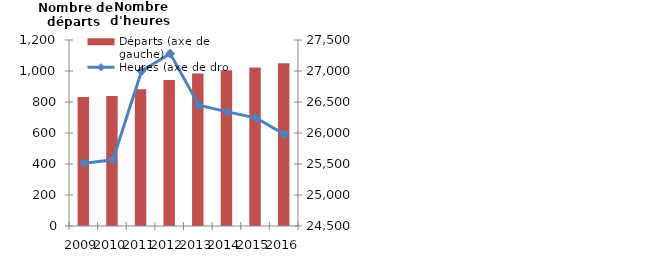
| Category | Départs (axe de gauche) |
|---|---|
| 2009.0 | 832.799 |
| 2010.0 | 838.642 |
| 2011.0 | 882.318 |
| 2012.0 | 941.368 |
| 2013.0 | 983.932 |
| 2014.0 | 1004.207 |
| 2015.0 | 1023 |
| 2016.0 | 1050.4 |